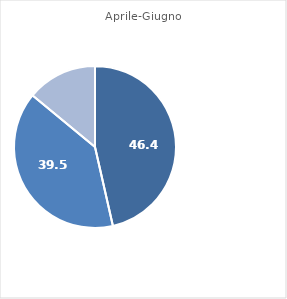
| Category | Series 1 |
|---|---|
| 0 | 46.444 |
| 1 | 39.543 |
| 2 | 14.012 |